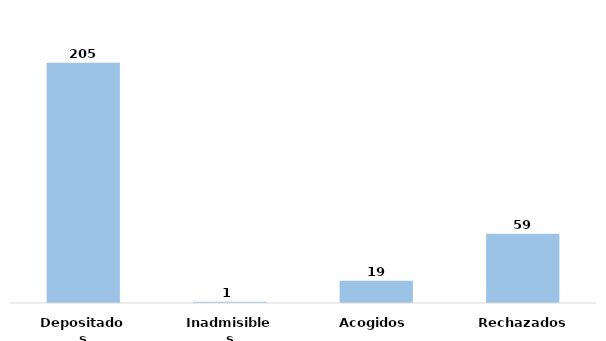
| Category | Series 0 |
|---|---|
| Depositados | 205 |
| Inadmisibles | 1 |
| Acogidos | 19 |
| Rechazados | 59 |